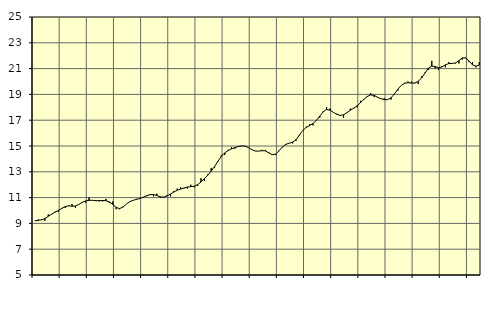
| Category | Piggar | Finansiell verksamhet, företagstjänster, SNI 64-82 |
|---|---|---|
| nan | 9.2 | 9.2 |
| 87.0 | 9.3 | 9.23 |
| 87.0 | 9.3 | 9.28 |
| 87.0 | 9.2 | 9.37 |
| nan | 9.7 | 9.55 |
| 88.0 | 9.7 | 9.72 |
| 88.0 | 9.9 | 9.87 |
| 88.0 | 9.9 | 10.01 |
| nan | 10.2 | 10.16 |
| 89.0 | 10.2 | 10.3 |
| 89.0 | 10.4 | 10.36 |
| 89.0 | 10.5 | 10.33 |
| nan | 10.2 | 10.35 |
| 90.0 | 10.5 | 10.47 |
| 90.0 | 10.6 | 10.63 |
| 90.0 | 10.6 | 10.74 |
| nan | 11 | 10.79 |
| 91.0 | 10.8 | 10.79 |
| 91.0 | 10.8 | 10.76 |
| 91.0 | 10.7 | 10.76 |
| nan | 10.7 | 10.78 |
| 92.0 | 10.9 | 10.76 |
| 92.0 | 10.6 | 10.67 |
| 92.0 | 10.7 | 10.47 |
| nan | 10.1 | 10.24 |
| 93.0 | 10.1 | 10.15 |
| 93.0 | 10.3 | 10.26 |
| 93.0 | 10.5 | 10.5 |
| nan | 10.7 | 10.68 |
| 94.0 | 10.8 | 10.79 |
| 94.0 | 10.9 | 10.86 |
| 94.0 | 10.9 | 10.93 |
| nan | 11 | 11.03 |
| 95.0 | 11.1 | 11.15 |
| 95.0 | 11.2 | 11.23 |
| 95.0 | 11.1 | 11.24 |
| nan | 11.3 | 11.16 |
| 96.0 | 11 | 11.06 |
| 96.0 | 11 | 11.04 |
| 96.0 | 11.2 | 11.13 |
| nan | 11.1 | 11.28 |
| 97.0 | 11.5 | 11.43 |
| 97.0 | 11.7 | 11.57 |
| 97.0 | 11.8 | 11.66 |
| nan | 11.7 | 11.74 |
| 98.0 | 11.7 | 11.82 |
| 98.0 | 12 | 11.85 |
| 98.0 | 11.8 | 11.88 |
| nan | 11.9 | 12 |
| 99.0 | 12.5 | 12.21 |
| 99.0 | 12.3 | 12.47 |
| 99.0 | 12.8 | 12.74 |
| nan | 13.3 | 13.05 |
| 0.0 | 13.3 | 13.41 |
| 0.0 | 13.8 | 13.82 |
| 0.0 | 14.3 | 14.2 |
| nan | 14.3 | 14.47 |
| 1.0 | 14.7 | 14.65 |
| 1.0 | 14.9 | 14.78 |
| 1.0 | 14.8 | 14.88 |
| nan | 15 | 14.96 |
| 2.0 | 15 | 15.01 |
| 2.0 | 15 | 14.99 |
| 2.0 | 14.9 | 14.87 |
| nan | 14.7 | 14.72 |
| 3.0 | 14.6 | 14.61 |
| 3.0 | 14.6 | 14.6 |
| 3.0 | 14.7 | 14.64 |
| nan | 14.7 | 14.62 |
| 4.0 | 14.5 | 14.46 |
| 4.0 | 14.3 | 14.33 |
| 4.0 | 14.3 | 14.37 |
| nan | 14.6 | 14.63 |
| 5.0 | 14.9 | 14.93 |
| 5.0 | 15.1 | 15.13 |
| 5.0 | 15.2 | 15.22 |
| nan | 15.2 | 15.3 |
| 6.0 | 15.4 | 15.49 |
| 6.0 | 15.8 | 15.84 |
| 6.0 | 16.2 | 16.21 |
| nan | 16.5 | 16.44 |
| 7.0 | 16.7 | 16.58 |
| 7.0 | 16.6 | 16.74 |
| 7.0 | 17 | 16.98 |
| nan | 17.2 | 17.32 |
| 8.0 | 17.7 | 17.65 |
| 8.0 | 18 | 17.83 |
| 8.0 | 17.9 | 17.78 |
| nan | 17.6 | 17.61 |
| 9.0 | 17.5 | 17.46 |
| 9.0 | 17.4 | 17.37 |
| 9.0 | 17.2 | 17.42 |
| nan | 17.6 | 17.58 |
| 10.0 | 17.9 | 17.77 |
| 10.0 | 17.9 | 17.93 |
| 10.0 | 18 | 18.11 |
| nan | 18.5 | 18.36 |
| 11.0 | 18.6 | 18.62 |
| 11.0 | 18.8 | 18.84 |
| 11.0 | 19.1 | 18.96 |
| nan | 18.8 | 18.93 |
| 12.0 | 18.8 | 18.78 |
| 12.0 | 18.7 | 18.67 |
| 12.0 | 18.7 | 18.6 |
| nan | 18.6 | 18.59 |
| 13.0 | 18.6 | 18.74 |
| 13.0 | 19 | 19.04 |
| 13.0 | 19.3 | 19.4 |
| nan | 19.7 | 19.7 |
| 14.0 | 19.9 | 19.86 |
| 14.0 | 20 | 19.91 |
| 14.0 | 20 | 19.88 |
| nan | 19.9 | 19.87 |
| 15.0 | 19.8 | 20.01 |
| 15.0 | 20.4 | 20.28 |
| 15.0 | 20.7 | 20.65 |
| nan | 20.9 | 21.03 |
| 16.0 | 21.6 | 21.2 |
| 16.0 | 21 | 21.16 |
| 16.0 | 20.9 | 21.07 |
| nan | 21.2 | 21.13 |
| 17.0 | 21.1 | 21.29 |
| 17.0 | 21.5 | 21.39 |
| 17.0 | 21.4 | 21.4 |
| nan | 21.4 | 21.44 |
| 18.0 | 21.4 | 21.62 |
| 18.0 | 21.7 | 21.83 |
| 18.0 | 21.8 | 21.83 |
| nan | 21.5 | 21.59 |
| 19.0 | 21.5 | 21.29 |
| 19.0 | 21.1 | 21.19 |
| 19.0 | 21.5 | 21.28 |